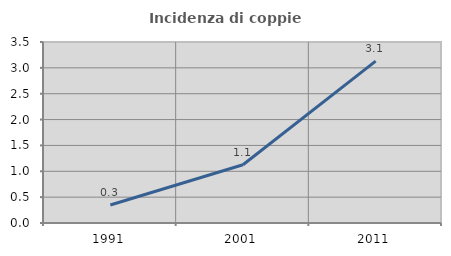
| Category | Incidenza di coppie miste |
|---|---|
| 1991.0 | 0.348 |
| 2001.0 | 1.127 |
| 2011.0 | 3.13 |